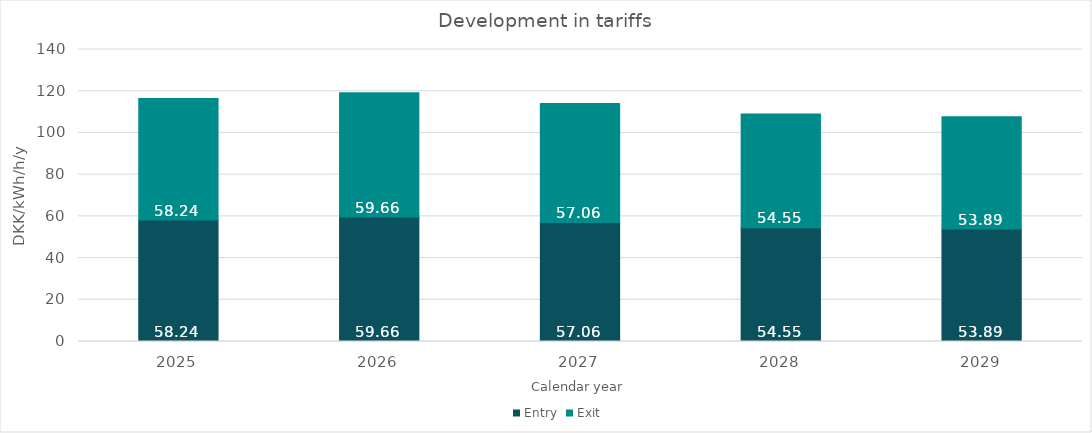
| Category | Entry | Exit |
|---|---|---|
| 2025.0 | 58.237 | 58.237 |
| 2026.0 | 59.661 | 59.661 |
| 2027.0 | 57.06 | 57.06 |
| 2028.0 | 54.545 | 54.545 |
| 2029.0 | 53.894 | 53.894 |